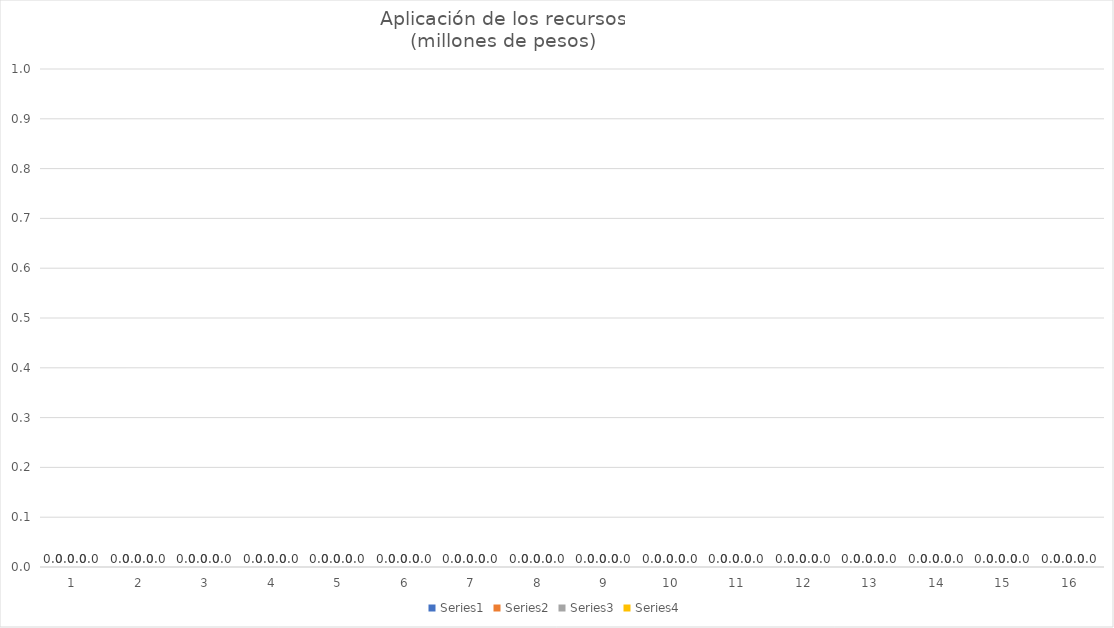
| Category | Series 0 | Series 1 | Series 2 | Series 3 |
|---|---|---|---|---|
| 0 | 2.731 | 0.795 | 3.231 | 28.012 |
| 1900-01-01 | 86.052 | 12.161 | 0.565 | 4.901 |
| 1900-01-02 | 40.659 | 8.553 | 0 | 20.341 |